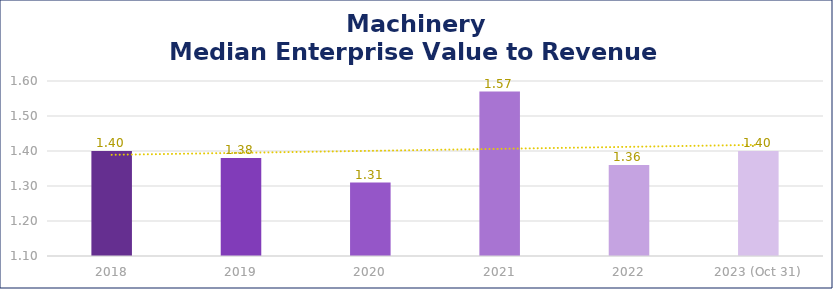
| Category | Machinery |
|---|---|
| 2018 | 1.4 |
| 2019 | 1.38 |
| 2020 | 1.31 |
| 2021 | 1.57 |
| 2022 | 1.36 |
| 2023 (Oct 31) | 1.4 |